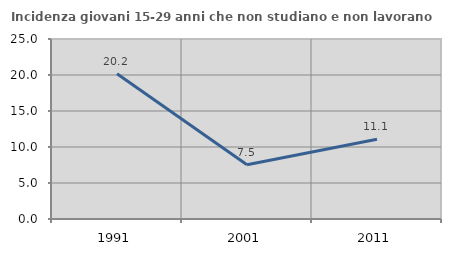
| Category | Incidenza giovani 15-29 anni che non studiano e non lavorano  |
|---|---|
| 1991.0 | 20.183 |
| 2001.0 | 7.524 |
| 2011.0 | 11.067 |